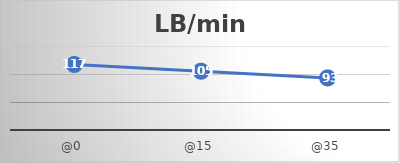
| Category | LB/min |
|---|---|
| @0 | 117 |
| @15 | 105 |
| @35 | 93 |